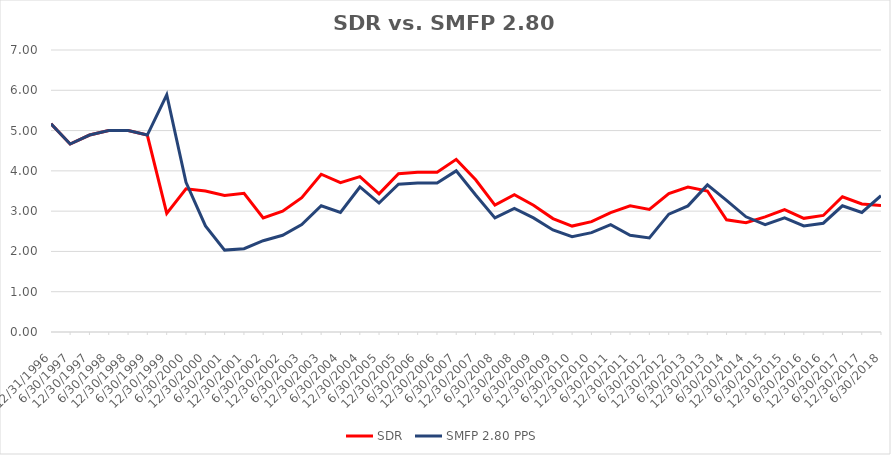
| Category | SDR | SMFP 2.80 PPS |
|---|---|---|
| 12/31/96 | 5.167 | 5.167 |
| 6/30/97 | 4.667 | 4.667 |
| 12/31/97 | 4.889 | 4.889 |
| 6/30/98 | 5 | 5 |
| 12/31/98 | 5 | 5 |
| 6/30/99 | 4.889 | 4.889 |
| 12/31/99 | 2.944 | 5.889 |
| 6/30/00 | 3.556 | 3.717 |
| 12/31/00 | 3.5 | 2.632 |
| 6/30/01 | 3.389 | 2.033 |
| 12/31/01 | 3.444 | 2.067 |
| 6/30/02 | 2.833 | 2.267 |
| 12/31/02 | 3 | 2.4 |
| 6/30/03 | 3.333 | 2.667 |
| 12/31/03 | 3.917 | 3.133 |
| 6/30/04 | 3.708 | 2.967 |
| 12/31/04 | 3.857 | 3.6 |
| 6/30/05 | 3.429 | 3.2 |
| 12/31/05 | 3.929 | 3.667 |
| 6/30/06 | 3.964 | 3.7 |
| 12/31/06 | 3.964 | 3.7 |
| 6/30/07 | 4.286 | 4 |
| 12/31/07 | 3.778 | 3.4 |
| 6/30/08 | 3.148 | 2.833 |
| 12/31/08 | 3.407 | 3.067 |
| 6/30/09 | 3.148 | 2.833 |
| 12/31/09 | 2.815 | 2.533 |
| 6/30/10 | 2.63 | 2.367 |
| 12/31/10 | 2.741 | 2.467 |
| 6/30/11 | 2.963 | 2.667 |
| 12/31/11 | 3.13 | 2.4 |
| 6/30/12 | 3.043 | 2.333 |
| 12/31/12 | 3.435 | 2.926 |
| 6/30/13 | 3.6 | 3.13 |
| 12/31/13 | 3.5 | 3.652 |
| 6/30/14 | 2.786 | 3.269 |
| 12/31/14 | 2.714 | 2.86 |
| 6/30/15 | 2.857 | 2.667 |
| 12/31/15 | 3.036 | 2.833 |
| 6/30/16 | 2.821 | 2.633 |
| 12/31/16 | 2.893 | 2.7 |
| 6/30/17 | 3.357 | 3.133 |
| 12/31/17 | 3.179 | 2.967 |
| 6/30/18 | 3.143 | 3.385 |